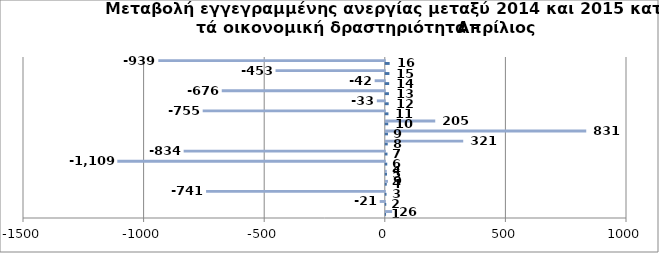
| Category | Series 0 | Series 1 |
|---|---|---|
| 0 | 1 | 26 |
| 1 | 2 | -21 |
| 2 | 3 | -741 |
| 3 | 4 | 9 |
| 4 | 5 | 4 |
| 5 | 6 | -1109 |
| 6 | 7 | -834 |
| 7 | 8 | 321 |
| 8 | 9 | 831 |
| 9 | 10 | 205 |
| 10 | 11 | -755 |
| 11 | 12 | -33 |
| 12 | 13 | -676 |
| 13 | 14 | -42 |
| 14 | 15 | -453 |
| 15 | 16 | -939 |